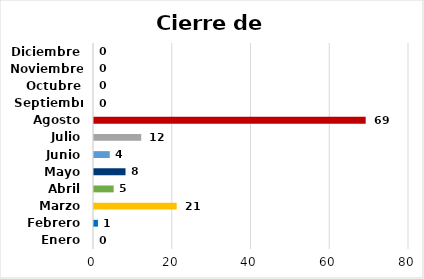
| Category | Cierre de Cuentas |
|---|---|
| Enero | 0 |
| Febrero | 1 |
| Marzo | 21 |
| Abril | 5 |
| Mayo | 8 |
| Junio | 4 |
| Julio | 12 |
| Agosto | 69 |
| Septiembre | 0 |
| Octubre | 0 |
| Noviembre | 0 |
| Diciembre | 0 |